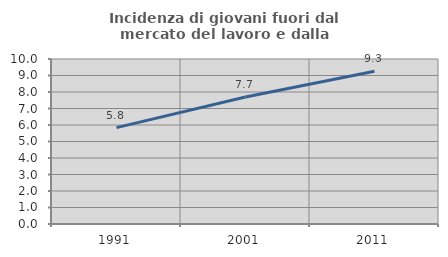
| Category | Incidenza di giovani fuori dal mercato del lavoro e dalla formazione  |
|---|---|
| 1991.0 | 5.843 |
| 2001.0 | 7.695 |
| 2011.0 | 9.258 |